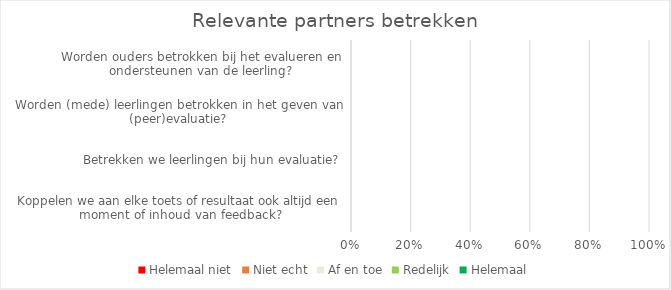
| Category | Helemaal niet | Niet echt | Af en toe | Redelijk | Helemaal |
|---|---|---|---|---|---|
| Koppelen we aan elke toets of resultaat ook altijd een moment of inhoud van feedback? | 0 | 0 | 0 | 0 | 0 |
| Betrekken we leerlingen bij hun evaluatie? | 0 | 0 | 0 | 0 | 0 |
| Worden (mede) leerlingen betrokken in het geven van (peer)evaluatie? | 0 | 0 | 0 | 0 | 0 |
| Worden ouders betrokken bij het evalueren en ondersteunen van de leerling? | 0 | 0 | 0 | 0 | 0 |